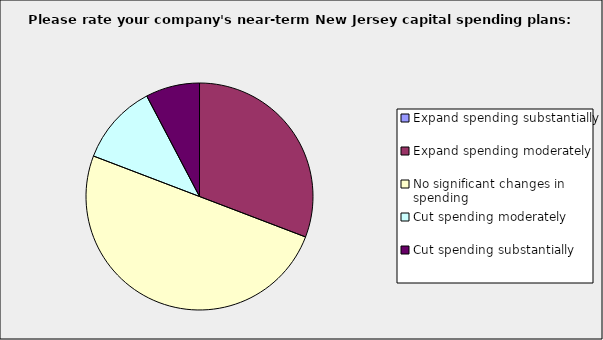
| Category | Series 0 |
|---|---|
| Expand spending substantially | 0 |
| Expand spending moderately | 0.308 |
| No significant changes in spending | 0.5 |
| Cut spending moderately | 0.115 |
| Cut spending substantially | 0.077 |